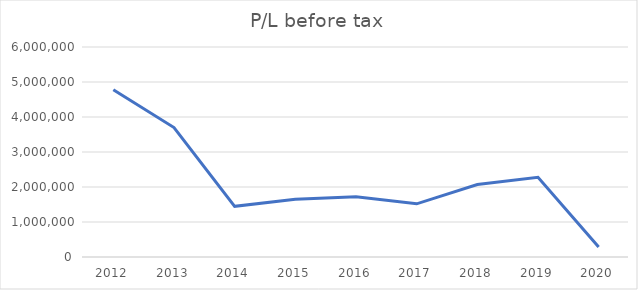
| Category | P/L before tax |
|---|---|
| 2012.0 | 4776106.504 |
| 2013.0 | 3698588.906 |
| 2014.0 | 1448291.609 |
| 2015.0 | 1646647.823 |
| 2016.0 | 1723417.911 |
| 2017.0 | 1519861.705 |
| 2018.0 | 2072339.191 |
| 2019.0 | 2277258.087 |
| 2020.0 | 287657.939 |